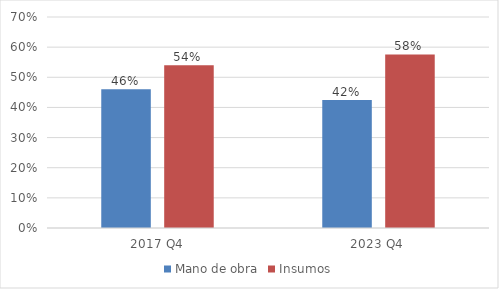
| Category | Mano de obra | Insumos |
|---|---|---|
| 2017 Q4 | 0.46 | 0.54 |
| 2023 Q4 | 0.424 | 0.576 |